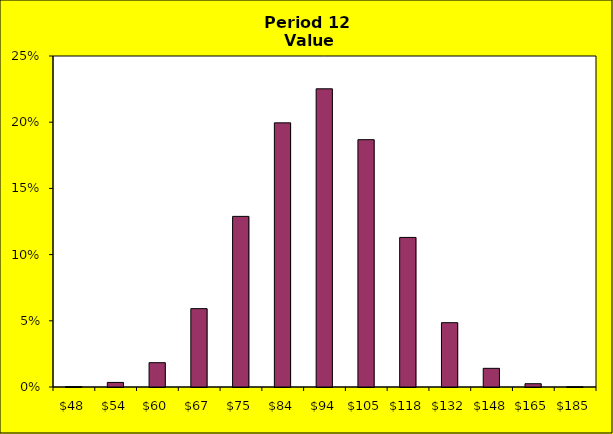
| Category | Series 1 |
|---|---|
| 48.02690759720768 | 0 |
| 53.732666895117 | 0.003 |
| 60.11628972400183 | 0.018 |
| 67.25830856738197 | 0.059 |
| 75.24882344059657 | 0.129 |
| 84.18863854599144 | 0.2 |
| 94.19053396659199 | 0.225 |
| 105.38068844129253 | 0.187 |
| 117.90027117055712 | 0.113 |
| 131.90722273402918 | 0.049 |
| 147.57824758718542 | 0.014 |
| 165.1110432733416 | 0.002 |
| 184.7267944735948 | 0 |